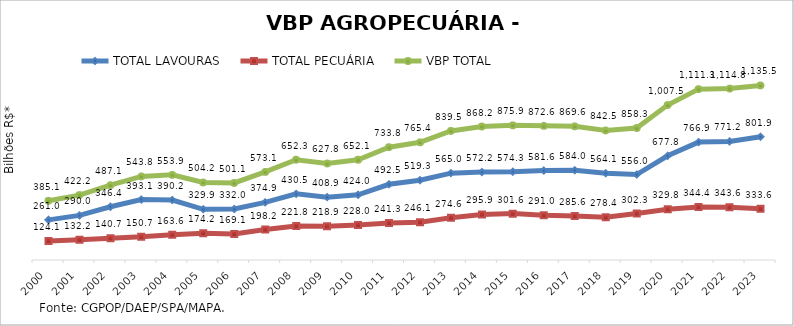
| Category | TOTAL LAVOURAS | TOTAL PECUÁRIA | VBP TOTAL |
|---|---|---|---|
| 2000 | 261.034 | 124.063 | 385.097 |
| 2001 | 289.961 | 132.196 | 422.157 |
| 2002 | 346.368 | 140.715 | 487.083 |
| 2003 | 393.125 | 150.725 | 543.85 |
| 2004 | 390.247 | 163.618 | 553.865 |
| 2005 | 329.936 | 174.222 | 504.158 |
| 2006 | 331.952 | 169.128 | 501.08 |
| 2007 | 374.879 | 198.182 | 573.061 |
| 2008 | 430.453 | 221.826 | 652.28 |
| 2009 | 408.874 | 218.878 | 627.752 |
| 2010 | 424.047 | 228.004 | 652.051 |
| 2011 | 492.478 | 241.302 | 733.781 |
| 2012 | 519.259 | 246.114 | 765.373 |
| 2013 | 564.957 | 274.555 | 839.512 |
| 2014 | 572.226 | 295.938 | 868.164 |
| 2015 | 574.302 | 301.624 | 875.926 |
| 2016 | 581.564 | 291.036 | 872.6 |
| 2017 | 583.979 | 285.584 | 869.563 |
| 2018 | 564.091 | 278.422 | 842.512 |
| 2019 | 555.979 | 302.345 | 858.323 |
| 2020 | 677.751 | 329.752 | 1007.503 |
| 2021 | 766.892 | 344.431 | 1111.323 |
| 2022 | 771.213 | 343.611 | 1114.823 |
| 2023 | 801.892 | 333.562 | 1135.454 |